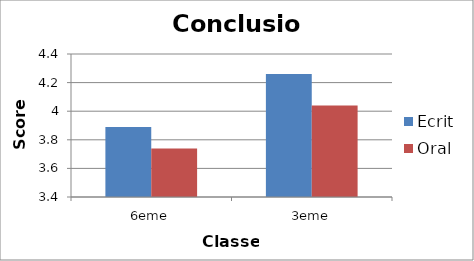
| Category | Ecrit | Oral |
|---|---|---|
| 6eme | 3.89 | 3.74 |
| 3eme | 4.26 | 4.04 |